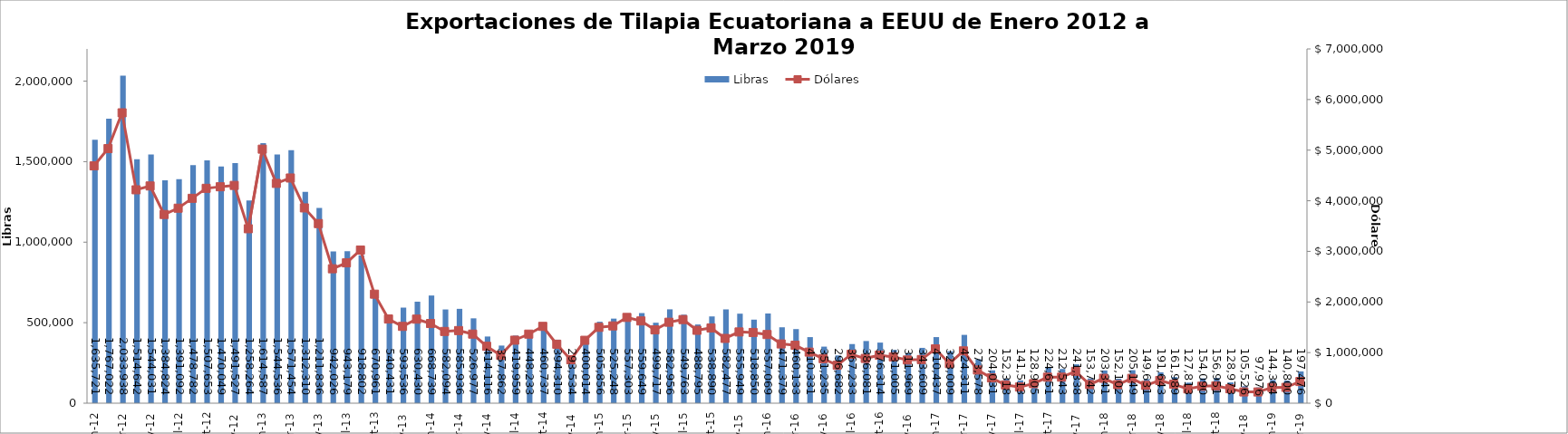
| Category | Libras  |
|---|---|
| 2012-01-01 | 1635720.607 |
| 2012-02-01 | 1767022.174 |
| 2012-03-01 | 2033937.505 |
| 2012-04-01 | 1514641.77 |
| 2012-05-01 | 1544031.293 |
| 2012-06-01 | 1384823.899 |
| 2012-07-01 | 1391091.577 |
| 2012-08-01 | 1478781.747 |
| 2012-09-01 | 1507653.188 |
| 2012-10-01 | 1470049.326 |
| 2012-11-01 | 1491526.539 |
| 2012-12-01 | 1258264 |
| 2013-01-01 | 1614587 |
| 2013-02-01 | 1544536.146 |
| 2013-03-01 | 1571454.312 |
| 2013-04-01 | 1312310.196 |
| 2013-05-01 | 1211835.551 |
| 2013-06-01 | 942025.58 |
| 2013-07-01 | 943178.586 |
| 2013-08-01 | 918802.324 |
| 2013-09-01 | 670961.192 |
| 2013-10-01 | 540431.235 |
| 2013-11-01 | 593535.64 |
| 2013-12-01 | 630429.621 |
| 2014-01-01 | 668739 |
| 2014-02-01 | 582093.766 |
| 2014-03-01 | 585936.383 |
| 2014-04-01 | 526976.561 |
| 2014-05-01 | 414116.473 |
| 2014-06-01 | 357861.695 |
| 2014-07-01 | 419958.663 |
| 2014-08-01 | 448233 |
| 2014-09-01 | 460737.149 |
| 2014-10-01 | 394310.347 |
| 2014-11-01 | 293533.672 |
| 2014-12-01 | 400013.647 |
| 2015-01-01 | 505856.493 |
| 2015-02-01 | 525248 |
| 2015-03-01 | 557303.039 |
| 2015-04-01 | 559648.733 |
| 2015-05-01 | 499716.682 |
| 2015-06-01 | 582955.764 |
| 2015-07-01 | 549763.307 |
| 2015-08-01 | 488795.094 |
| 2015-09-01 | 538890.219 |
| 2015-10-01 | 582477.366 |
| 2015-11-01 | 555949.414 |
| 2015-12-01 | 518850.405 |
| 2016-01-01 | 557069.351 |
| 2016-02-01 | 471378.754 |
| 2016-03-01 | 460133.089 |
| 2016-04-01 | 410331.175 |
| 2016-05-01 | 351235 |
| 2016-06-01 | 296682 |
| 2016-07-01 | 367233.45 |
| 2016-08-01 | 386080.575 |
| 2016-09-01 | 376314.197 |
| 2016-10-01 | 331005.258 |
| 2016-11-01 | 311968.537 |
| 2016-12-01 | 343608.956 |
| 2017-01-01 | 410436.996 |
| 2017-02-01 | 323009.174 |
| 2017-03-01 | 424310.544 |
| 2017-04-01 | 273577.632 |
| 2017-05-01 | 204031.321 |
| 2017-06-01 | 152318.019 |
| 2017-07-01 | 141513.274 |
| 2017-08-01 | 128905.167 |
| 2017-09-01 | 224650.945 |
| 2017-10-01 | 212543.281 |
| 2017-11-01 | 241337.562 |
| 2017-12-01 | 153742.19 |
| 2018-01-01 | 203341.281 |
| 2018-02-01 | 152101.968 |
| 2018-03-01 | 205149.053 |
| 2018-04-01 | 149630.611 |
| 2018-05-01 | 191643 |
| 2018-06-01 | 161989 |
| 2018-07-01 | 127813 |
| 2018-08-01 | 154089.894 |
| 2018-09-01 | 156951.494 |
| 2018-10-01 | 128972.628 |
| 2018-11-01 | 105526.466 |
| 2018-12-01 | 97975.634 |
| 2019-01-01 | 144364.157 |
| 2019-02-01 | 140800 |
| 2019-03-01 | 197476 |